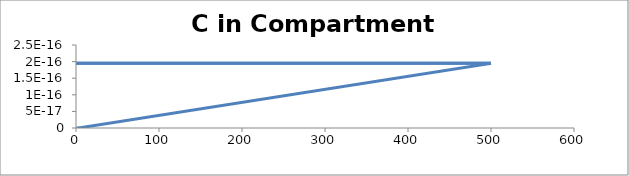
| Category | C - Sys 4 |
|---|---|
| 0.5 | 0 |
| 1.0 | 0 |
| 1.5 | 0 |
| 2.0 | 0 |
| 2.5 | 0 |
| 3.0 | 0 |
| 3.5 | 0 |
| 4.0 | 0 |
| 4.500000000000001 | 0 |
| 5.0 | 0 |
| 5.5 | 0 |
| 6.0 | 0 |
| 6.500000000000001 | 0 |
| 7.0 | 0 |
| 7.5 | 0 |
| 8.0 | 0 |
| 8.5 | 0 |
| 9.000000000000002 | 0 |
| 9.5 | 0 |
| 10.0 | 0 |
| 10.5 | 0 |
| 11.0 | 0 |
| 11.5 | 0 |
| 12.0 | 0 |
| 12.5 | 0 |
| 13.000000000000002 | 0 |
| 13.5 | 0 |
| 14.0 | 0 |
| 14.5 | 0 |
| 15.0 | 0 |
| 15.5 | 0 |
| 16.0 | 0 |
| 16.5 | 0 |
| 17.0 | 0 |
| 17.5 | 0 |
| 18.000000000000004 | 0 |
| 18.5 | 0 |
| 19.0 | 0 |
| 19.5 | 0 |
| 20.0 | 0 |
| 20.5 | 0 |
| 21.0 | 0 |
| 21.5 | 0 |
| 22.0 | 0 |
| 22.5 | 0 |
| 23.0 | 0 |
| 23.5 | 0 |
| 24.0 | 0 |
| 24.5 | 0 |
| 25.0 | 0 |
| 25.500000000000004 | 0 |
| 26.000000000000004 | 0 |
| 26.5 | 0 |
| 27.0 | 0 |
| 27.5 | 0 |
| 28.0 | 0 |
| 28.5 | 0 |
| 29.0 | 0 |
| 29.500000000000004 | 0 |
| 30.0 | 0 |
| 30.5 | 0 |
| 31.0 | 0 |
| 31.5 | 0 |
| 32.0 | 0 |
| 32.5 | 0 |
| 33.0 | 0 |
| 33.5 | 0 |
| 34.0 | 0 |
| 34.5 | 0 |
| 35.0 | 0 |
| 35.50000000000001 | 0 |
| 36.00000000000001 | 0 |
| 36.5 | 0 |
| 37.0 | 0 |
| 37.5 | 0 |
| 38.0 | 0 |
| 38.5 | 0 |
| 39.0 | 0 |
| 39.5 | 0 |
| 40.0 | 0 |
| 40.5 | 0 |
| 41.0 | 0 |
| 41.5 | 0 |
| 42.0 | 0 |
| 42.5 | 0 |
| 43.0 | 0 |
| 43.50000000000001 | 0 |
| 44.0 | 0 |
| 44.5 | 0 |
| 45.0 | 0 |
| 45.5 | 0 |
| 46.0 | 0 |
| 46.5 | 0 |
| 47.0 | 0 |
| 47.5 | 0 |
| 48.0 | 0 |
| 48.5 | 0 |
| 49.0 | 0 |
| 49.5 | 0 |
| 50.0 | 0 |
| 50.5 | 0 |
| 51.00000000000001 | 0 |
| 51.50000000000001 | 0 |
| 52.00000000000001 | 0 |
| 52.5 | 0 |
| 53.0 | 0 |
| 53.5 | 0 |
| 54.0 | 0 |
| 54.5 | 0 |
| 55.0 | 0 |
| 55.5 | 0 |
| 56.0 | 0 |
| 56.5 | 0 |
| 57.0 | 0 |
| 57.5 | 0 |
| 58.0 | 0 |
| 58.5 | 0 |
| 59.00000000000001 | 0 |
| 59.50000000000001 | 0 |
| 60.0 | 0 |
| 60.5 | 0 |
| 61.0 | 0 |
| 61.5 | 0 |
| 62.0 | 0 |
| 62.5 | 0 |
| 63.0 | 0 |
| 63.5 | 0 |
| 64.0 | 0 |
| 64.5 | 0 |
| 65.0 | 0 |
| 65.5 | 0 |
| 66.0 | 0 |
| 66.5 | 0 |
| 67.0 | 0 |
| 67.5 | 0 |
| 68.0 | 0 |
| 68.5 | 0 |
| 69.0 | 0 |
| 69.5 | 0 |
| 70.0 | 0 |
| 70.5 | 0 |
| 71.00000000000001 | 0 |
| 71.50000000000001 | 0 |
| 72.00000000000001 | 0 |
| 72.5 | 0 |
| 73.0 | 0 |
| 73.5 | 0 |
| 74.0 | 0 |
| 74.5 | 0 |
| 75.0 | 0 |
| 75.5 | 0 |
| 76.0 | 0 |
| 76.5 | 0 |
| 77.0 | 0 |
| 77.5 | 0 |
| 78.0 | 0 |
| 78.5 | 0 |
| 79.0 | 0 |
| 79.5 | 0 |
| 80.0 | 0 |
| 80.5 | 0 |
| 81.0 | 0 |
| 81.5 | 0 |
| 82.0 | 0 |
| 82.5 | 0 |
| 83.0 | 0 |
| 83.5 | 0 |
| 84.0 | 0 |
| 84.5 | 0 |
| 85.0 | 0 |
| 85.5 | 0 |
| 86.0 | 0 |
| 86.50000000000001 | 0 |
| 87.00000000000001 | 0 |
| 87.50000000000001 | 0 |
| 88.0 | 0 |
| 88.5 | 0 |
| 89.0 | 0 |
| 89.5 | 0 |
| 90.0 | 0 |
| 90.5 | 0 |
| 91.0 | 0 |
| 91.5 | 0 |
| 92.0 | 0 |
| 92.5 | 0 |
| 93.0 | 0 |
| 93.5 | 0 |
| 94.0 | 0 |
| 94.5 | 0 |
| 95.0 | 0 |
| 95.5 | 0 |
| 96.0 | 0 |
| 96.5 | 0 |
| 97.0 | 0 |
| 97.5 | 0 |
| 98.0 | 0 |
| 98.5 | 0 |
| 99.0 | 0 |
| 99.5 | 0 |
| 100.0 | 0 |
| 100.5 | 0 |
| 101.0 | 0 |
| 101.5 | 0 |
| 102.00000000000001 | 0 |
| 102.50000000000001 | 0 |
| 103.00000000000001 | 0 |
| 103.50000000000001 | 0 |
| 104.00000000000001 | 0 |
| 104.5 | 0 |
| 105.0 | 0 |
| 105.5 | 0 |
| 106.0 | 0 |
| 106.5 | 0 |
| 107.0 | 0 |
| 107.5 | 0 |
| 108.0 | 0 |
| 108.5 | 0 |
| 109.0 | 0 |
| 109.5 | 0 |
| 110.0 | 0 |
| 110.5 | 0 |
| 111.0 | 0 |
| 111.5 | 0 |
| 112.0 | 0 |
| 112.5 | 0 |
| 113.0 | 0 |
| 113.5 | 0 |
| 114.0 | 0 |
| 114.5 | 0 |
| 115.0 | 0 |
| 115.5 | 0 |
| 116.0 | 0 |
| 116.5 | 0 |
| 117.0 | 0 |
| 117.50000000000001 | 0 |
| 118.00000000000001 | 0 |
| 118.50000000000001 | 0 |
| 119.00000000000001 | 0 |
| 119.50000000000001 | 0 |
| 120.0 | 0 |
| 120.5 | 0 |
| 121.0 | 0 |
| 121.5 | 0 |
| 122.0 | 0 |
| 122.5 | 0 |
| 123.0 | 0 |
| 123.5 | 0 |
| 124.0 | 0 |
| 124.5 | 0 |
| 125.0 | 0 |
| 125.5 | 0 |
| 126.0 | 0 |
| 126.5 | 0 |
| 127.0 | 0 |
| 127.5 | 0 |
| 128.0 | 0 |
| 128.5 | 0 |
| 129.0 | 0 |
| 129.5 | 0 |
| 130.0 | 0 |
| 130.5 | 0 |
| 131.0 | 0 |
| 131.5 | 0 |
| 132.0 | 0 |
| 132.5 | 0 |
| 133.0 | 0 |
| 133.5 | 0 |
| 134.0 | 0 |
| 134.5 | 0 |
| 135.0 | 0 |
| 135.5 | 0 |
| 136.0 | 0 |
| 136.5 | 0 |
| 137.0 | 0 |
| 137.5 | 0 |
| 138.0 | 0 |
| 138.5 | 0 |
| 139.0 | 0 |
| 139.5 | 0 |
| 140.0 | 0 |
| 140.5 | 0 |
| 141.0 | 0 |
| 141.50000000000003 | 0 |
| 142.00000000000003 | 0 |
| 142.50000000000003 | 0 |
| 143.00000000000003 | 0 |
| 143.50000000000003 | 0 |
| 144.00000000000003 | 0 |
| 144.5 | 0 |
| 145.0 | 0 |
| 145.5 | 0 |
| 146.0 | 0 |
| 146.5 | 0 |
| 147.0 | 0 |
| 147.5 | 0 |
| 148.0 | 0 |
| 148.5 | 0 |
| 149.0 | 0 |
| 149.5 | 0 |
| 150.0 | 0 |
| 150.5 | 0 |
| 151.0 | 0 |
| 151.5 | 0 |
| 152.0 | 0 |
| 152.5 | 0 |
| 153.0 | 0 |
| 153.5 | 0 |
| 154.0 | 0 |
| 154.5 | 0 |
| 155.0 | 0 |
| 155.5 | 0 |
| 156.0 | 0 |
| 156.5 | 0 |
| 157.0 | 0 |
| 157.5 | 0 |
| 158.0 | 0 |
| 158.5 | 0 |
| 159.0 | 0 |
| 159.5 | 0 |
| 160.0 | 0 |
| 160.5 | 0 |
| 161.0 | 0 |
| 161.5 | 0 |
| 162.0 | 0 |
| 162.5 | 0 |
| 163.0 | 0 |
| 163.5 | 0 |
| 164.0 | 0 |
| 164.5 | 0 |
| 165.0 | 0 |
| 165.5 | 0 |
| 166.0 | 0 |
| 166.5 | 0 |
| 167.0 | 0 |
| 167.5 | 0 |
| 168.0 | 0 |
| 168.5 | 0 |
| 169.0 | 0 |
| 169.5 | 0 |
| 170.0 | 0 |
| 170.5 | 0 |
| 171.0 | 0 |
| 171.5 | 0 |
| 172.0 | 0 |
| 172.50000000000003 | 0 |
| 173.00000000000003 | 0 |
| 173.50000000000003 | 0 |
| 174.00000000000003 | 0 |
| 174.50000000000003 | 0 |
| 175.00000000000003 | 0 |
| 175.50000000000003 | 0 |
| 176.0 | 0 |
| 176.5 | 0 |
| 177.0 | 0 |
| 177.5 | 0 |
| 178.0 | 0 |
| 178.5 | 0 |
| 179.0 | 0 |
| 179.5 | 0 |
| 180.0 | 0 |
| 180.5 | 0 |
| 181.0 | 0 |
| 181.5 | 0 |
| 182.0 | 0 |
| 182.5 | 0 |
| 183.0 | 0 |
| 183.5 | 0 |
| 184.0 | 0 |
| 184.5 | 0 |
| 185.0 | 0 |
| 185.5 | 0 |
| 186.0 | 0 |
| 186.5 | 0 |
| 187.0 | 0 |
| 187.5 | 0 |
| 188.0 | 0 |
| 188.5 | 0 |
| 189.0 | 0 |
| 189.5 | 0 |
| 190.0 | 0 |
| 190.5 | 0 |
| 191.0 | 0 |
| 191.5 | 0 |
| 192.0 | 0 |
| 192.5 | 0 |
| 193.0 | 0 |
| 193.5 | 0 |
| 194.0 | 0 |
| 194.5 | 0 |
| 195.0 | 0 |
| 195.5 | 0 |
| 196.0 | 0 |
| 196.5 | 0 |
| 197.0 | 0 |
| 197.5 | 0 |
| 198.0 | 0 |
| 198.5 | 0 |
| 199.0 | 0 |
| 199.5 | 0 |
| 200.0 | 0 |
| 200.5 | 0 |
| 201.0 | 0 |
| 201.5 | 0 |
| 202.0 | 0 |
| 202.5 | 0 |
| 203.0 | 0 |
| 203.5 | 0 |
| 204.00000000000003 | 0 |
| 204.50000000000003 | 0 |
| 205.00000000000003 | 0 |
| 205.50000000000003 | 0 |
| 206.00000000000003 | 0 |
| 206.50000000000003 | 0 |
| 207.00000000000003 | 0 |
| 207.50000000000003 | 0 |
| 208.00000000000003 | 0 |
| 208.5 | 0 |
| 209.0 | 0 |
| 209.5 | 0 |
| 210.0 | 0 |
| 210.5 | 0 |
| 211.0 | 0 |
| 211.5 | 0 |
| 212.0 | 0 |
| 212.5 | 0 |
| 213.0 | 0 |
| 213.5 | 0 |
| 214.0 | 0 |
| 214.5 | 0 |
| 215.0 | 0 |
| 215.5 | 0 |
| 216.0 | 0 |
| 216.5 | 0 |
| 217.0 | 0 |
| 217.5 | 0 |
| 218.0 | 0 |
| 218.5 | 0 |
| 219.0 | 0 |
| 219.5 | 0 |
| 220.0 | 0 |
| 220.5 | 0 |
| 221.0 | 0 |
| 221.5 | 0 |
| 222.0 | 0 |
| 222.5 | 0 |
| 223.0 | 0 |
| 223.5 | 0 |
| 224.0 | 0 |
| 224.5 | 0 |
| 225.0 | 0 |
| 225.5 | 0 |
| 226.0 | 0 |
| 226.5 | 0 |
| 227.0 | 0 |
| 227.5 | 0 |
| 228.0 | 0 |
| 228.5 | 0 |
| 229.0 | 0 |
| 229.5 | 0 |
| 230.0 | 0 |
| 230.5 | 0 |
| 231.0 | 0 |
| 231.5 | 0 |
| 232.0 | 0 |
| 232.5 | 0 |
| 233.0 | 0 |
| 233.5 | 0 |
| 234.0 | 0 |
| 234.5 | 0 |
| 235.00000000000003 | 0 |
| 235.50000000000003 | 0 |
| 236.00000000000003 | 0 |
| 236.50000000000003 | 0 |
| 237.00000000000003 | 0 |
| 237.50000000000003 | 0 |
| 238.00000000000003 | 0 |
| 238.50000000000003 | 0 |
| 239.00000000000003 | 0 |
| 239.50000000000003 | 0 |
| 240.0 | 0 |
| 240.5 | 0 |
| 241.0 | 0 |
| 241.5 | 0 |
| 242.0 | 0 |
| 242.5 | 0 |
| 243.0 | 0 |
| 243.5 | 0 |
| 244.0 | 0 |
| 244.5 | 0 |
| 245.0 | 0 |
| 245.5 | 0 |
| 246.0 | 0 |
| 246.5 | 0 |
| 247.0 | 0 |
| 247.5 | 0 |
| 248.0 | 0 |
| 248.5 | 0 |
| 249.0 | 0 |
| 249.5 | 0 |
| 250.0 | 0 |
| 250.5 | 0 |
| 251.0 | 0 |
| 251.5 | 0 |
| 252.0 | 0 |
| 252.5 | 0 |
| 253.0 | 0 |
| 253.5 | 0 |
| 254.0 | 0 |
| 254.5 | 0 |
| 255.0 | 0 |
| 255.5 | 0 |
| 256.0 | 0 |
| 256.5 | 0 |
| 257.0 | 0 |
| 257.5 | 0 |
| 258.0 | 0 |
| 258.5 | 0 |
| 259.0 | 0 |
| 259.5 | 0 |
| 260.0 | 0 |
| 260.5 | 0 |
| 261.0 | 0 |
| 261.5 | 0 |
| 262.0 | 0 |
| 262.5 | 0 |
| 263.0 | 0 |
| 263.5 | 0 |
| 264.0 | 0 |
| 264.5 | 0 |
| 265.0 | 0 |
| 265.5 | 0 |
| 266.0 | 0 |
| 266.5 | 0 |
| 267.0 | 0 |
| 267.5 | 0 |
| 268.0 | 0 |
| 268.5 | 0 |
| 269.0 | 0 |
| 269.5 | 0 |
| 270.0 | 0 |
| 270.5 | 0 |
| 271.0 | 0 |
| 271.5 | 0 |
| 272.0 | 0 |
| 272.5 | 0 |
| 273.0 | 0 |
| 273.5 | 0 |
| 274.0 | 0 |
| 274.5 | 0 |
| 275.0 | 0 |
| 275.5 | 0 |
| 276.0 | 0 |
| 276.5 | 0 |
| 277.0 | 0 |
| 277.5 | 0 |
| 278.0 | 0 |
| 278.5 | 0 |
| 279.0 | 0 |
| 279.5 | 0 |
| 280.0 | 0 |
| 280.5 | 0 |
| 281.0 | 0 |
| 281.5 | 0 |
| 282.0 | 0 |
| 282.50000000000006 | 0 |
| 283.00000000000006 | 0 |
| 283.50000000000006 | 0 |
| 284.00000000000006 | 0 |
| 284.50000000000006 | 0 |
| 285.00000000000006 | 0 |
| 285.50000000000006 | 0 |
| 286.00000000000006 | 0 |
| 286.50000000000006 | 0 |
| 287.00000000000006 | 0 |
| 287.50000000000006 | 0 |
| 288.00000000000006 | 0 |
| 288.5 | 0 |
| 289.0 | 0 |
| 289.5 | 0 |
| 290.0 | 0 |
| 290.5 | 0 |
| 291.0 | 0 |
| 291.5 | 0 |
| 292.0 | 0 |
| 292.5 | 0 |
| 293.0 | 0 |
| 293.5 | 0 |
| 294.0 | 0 |
| 294.5 | 0 |
| 295.0 | 0 |
| 295.5 | 0 |
| 296.0 | 0 |
| 296.5 | 0 |
| 297.0 | 0 |
| 297.5 | 0 |
| 298.0 | 0 |
| 298.5 | 0 |
| 299.0 | 0 |
| 299.5 | 0 |
| 300.0 | 0 |
| 300.5 | 0 |
| 301.0 | 0 |
| 301.5 | 0 |
| 302.0 | 0 |
| 302.5 | 0 |
| 303.0 | 0 |
| 303.5 | 0 |
| 304.0 | 0 |
| 304.5 | 0 |
| 305.0 | 0 |
| 305.5 | 0 |
| 306.0 | 0 |
| 306.5 | 0 |
| 307.0 | 0 |
| 307.5 | 0 |
| 308.0 | 0 |
| 308.5 | 0 |
| 309.0 | 0 |
| 309.5 | 0 |
| 310.0 | 0 |
| 310.5 | 0 |
| 311.0 | 0 |
| 311.5 | 0 |
| 312.0 | 0 |
| 312.5 | 0 |
| 313.0 | 0 |
| 313.5 | 0 |
| 314.0 | 0 |
| 314.5 | 0 |
| 315.0 | 0 |
| 315.5 | 0 |
| 316.0 | 0 |
| 316.5 | 0 |
| 317.0 | 0 |
| 317.5 | 0 |
| 318.0 | 0 |
| 318.5 | 0 |
| 319.0 | 0 |
| 319.5 | 0 |
| 320.0 | 0 |
| 320.5 | 0 |
| 321.0 | 0 |
| 321.5 | 0 |
| 322.0 | 0 |
| 322.5 | 0 |
| 323.0 | 0 |
| 323.5 | 0 |
| 324.0 | 0 |
| 324.5 | 0 |
| 325.0 | 0 |
| 325.5 | 0 |
| 326.0 | 0 |
| 326.5 | 0 |
| 327.0 | 0 |
| 327.5 | 0 |
| 328.0 | 0 |
| 328.5 | 0 |
| 329.0 | 0 |
| 329.5 | 0 |
| 330.0 | 0 |
| 330.5 | 0 |
| 331.0 | 0 |
| 331.5 | 0 |
| 332.0 | 0 |
| 332.5 | 0 |
| 333.0 | 0 |
| 333.5 | 0 |
| 334.0 | 0 |
| 334.5 | 0 |
| 335.0 | 0 |
| 335.5 | 0 |
| 336.0 | 0 |
| 336.5 | 0 |
| 337.0 | 0 |
| 337.5 | 0 |
| 338.0 | 0 |
| 338.5 | 0 |
| 339.0 | 0 |
| 339.5 | 0 |
| 340.0 | 0 |
| 340.5 | 0 |
| 341.0 | 0 |
| 341.5 | 0 |
| 342.0 | 0 |
| 342.5 | 0 |
| 343.0 | 0 |
| 343.5 | 0 |
| 344.0 | 0 |
| 344.5 | 0 |
| 345.00000000000006 | 0 |
| 345.50000000000006 | 0 |
| 346.00000000000006 | 0 |
| 346.50000000000006 | 0 |
| 347.00000000000006 | 0 |
| 347.50000000000006 | 0 |
| 348.00000000000006 | 0 |
| 348.50000000000006 | 0 |
| 349.00000000000006 | 0 |
| 349.50000000000006 | 0 |
| 350.00000000000006 | 0 |
| 350.50000000000006 | 0 |
| 351.00000000000006 | 0 |
| 351.50000000000006 | 0 |
| 352.0 | 0 |
| 352.5 | 0 |
| 353.0 | 0 |
| 353.5 | 0 |
| 354.0 | 0 |
| 354.5 | 0 |
| 355.0 | 0 |
| 355.5 | 0 |
| 356.0 | 0 |
| 356.5 | 0 |
| 357.0 | 0 |
| 357.5 | 0 |
| 358.0 | 0 |
| 358.5 | 0 |
| 359.0 | 0 |
| 359.5 | 0 |
| 360.0 | 0 |
| 360.5 | 0 |
| 361.0 | 0 |
| 361.5 | 0 |
| 362.0 | 0 |
| 362.5 | 0 |
| 363.0 | 0 |
| 363.5 | 0 |
| 364.0 | 0 |
| 364.5 | 0 |
| 365.0 | 0 |
| 365.5 | 0 |
| 366.0 | 0 |
| 366.5 | 0 |
| 367.0 | 0 |
| 367.5 | 0 |
| 368.0 | 0 |
| 368.5 | 0 |
| 369.0 | 0 |
| 369.5 | 0 |
| 370.0 | 0 |
| 370.5 | 0 |
| 371.0 | 0 |
| 371.5 | 0 |
| 372.0 | 0 |
| 372.5 | 0 |
| 373.0 | 0 |
| 373.5 | 0 |
| 374.0 | 0 |
| 374.5 | 0 |
| 375.0 | 0 |
| 375.5 | 0 |
| 376.0 | 0 |
| 376.5 | 0 |
| 377.0 | 0 |
| 377.5 | 0 |
| 378.0 | 0 |
| 378.5 | 0 |
| 379.0 | 0 |
| 379.5 | 0 |
| 380.0 | 0 |
| 380.5 | 0 |
| 381.0 | 0 |
| 381.5 | 0 |
| 382.0 | 0 |
| 382.5 | 0 |
| 383.0 | 0 |
| 383.5 | 0 |
| 384.0 | 0 |
| 384.5 | 0 |
| 385.0 | 0 |
| 385.5 | 0 |
| 386.0 | 0 |
| 386.5 | 0 |
| 387.0 | 0 |
| 387.5 | 0 |
| 388.0 | 0 |
| 388.5 | 0 |
| 389.0 | 0 |
| 389.5 | 0 |
| 390.0 | 0 |
| 390.5 | 0 |
| 391.0 | 0 |
| 391.5 | 0 |
| 392.0 | 0 |
| 392.5 | 0 |
| 393.0 | 0 |
| 393.5 | 0 |
| 394.0 | 0 |
| 394.5 | 0 |
| 395.0 | 0 |
| 395.5 | 0 |
| 396.0 | 0 |
| 396.5 | 0 |
| 397.0 | 0 |
| 397.5 | 0 |
| 398.0 | 0 |
| 398.5 | 0 |
| 399.0 | 0 |
| 399.5 | 0 |
| 400.0 | 0 |
| 400.5 | 0 |
| 401.0 | 0 |
| 401.5 | 0 |
| 402.0 | 0 |
| 402.5 | 0 |
| 403.0 | 0 |
| 403.5 | 0 |
| 404.0 | 0 |
| 404.5 | 0 |
| 405.0 | 0 |
| 405.5 | 0 |
| 406.0 | 0 |
| 406.5 | 0 |
| 407.0 | 0 |
| 407.50000000000006 | 0 |
| 408.00000000000006 | 0 |
| 408.50000000000006 | 0 |
| 409.00000000000006 | 0 |
| 409.50000000000006 | 0 |
| 410.00000000000006 | 0 |
| 410.50000000000006 | 0 |
| 411.00000000000006 | 0 |
| 411.50000000000006 | 0 |
| 412.00000000000006 | 0 |
| 412.50000000000006 | 0 |
| 413.00000000000006 | 0 |
| 413.50000000000006 | 0 |
| 414.00000000000006 | 0 |
| 414.50000000000006 | 0 |
| 415.00000000000006 | 0 |
| 415.50000000000006 | 0 |
| 416.00000000000006 | 0 |
| 416.5 | 0 |
| 417.0 | 0 |
| 417.5 | 0 |
| 418.0 | 0 |
| 418.5 | 0 |
| 419.0 | 0 |
| 419.5 | 0 |
| 420.0 | 0 |
| 420.5 | 0 |
| 421.0 | 0 |
| 421.5 | 0 |
| 422.0 | 0 |
| 422.5 | 0 |
| 423.0 | 0 |
| 423.5 | 0 |
| 424.0 | 0 |
| 424.5 | 0 |
| 425.0 | 0 |
| 425.5 | 0 |
| 426.0 | 0 |
| 426.5 | 0 |
| 427.0 | 0 |
| 427.5 | 0 |
| 428.0 | 0 |
| 428.5 | 0 |
| 429.0 | 0 |
| 429.5 | 0 |
| 430.0 | 0 |
| 430.5 | 0 |
| 431.0 | 0 |
| 431.5 | 0 |
| 432.0 | 0 |
| 432.5 | 0 |
| 433.0 | 0 |
| 433.5 | 0 |
| 434.0 | 0 |
| 434.5 | 0 |
| 435.0 | 0 |
| 435.5 | 0 |
| 436.0 | 0 |
| 436.5 | 0 |
| 437.0 | 0 |
| 437.5 | 0 |
| 438.0 | 0 |
| 438.5 | 0 |
| 439.0 | 0 |
| 439.5 | 0 |
| 440.0 | 0 |
| 440.5 | 0 |
| 441.0 | 0 |
| 441.5 | 0 |
| 442.0 | 0 |
| 442.5 | 0 |
| 443.0 | 0 |
| 443.5 | 0 |
| 444.0 | 0 |
| 444.5 | 0 |
| 445.0 | 0 |
| 445.5 | 0 |
| 446.0 | 0 |
| 446.5 | 0 |
| 447.0 | 0 |
| 447.5 | 0 |
| 448.0 | 0 |
| 448.5 | 0 |
| 449.0 | 0 |
| 449.5 | 0 |
| 450.0 | 0 |
| 450.5 | 0 |
| 451.0 | 0 |
| 451.5 | 0 |
| 452.0 | 0 |
| 452.5 | 0 |
| 453.0 | 0 |
| 453.5 | 0 |
| 454.0 | 0 |
| 454.5 | 0 |
| 455.0 | 0 |
| 455.5 | 0 |
| 456.0 | 0 |
| 456.5 | 0 |
| 457.0 | 0 |
| 457.5 | 0 |
| 458.0 | 0 |
| 458.5 | 0 |
| 459.0 | 0 |
| 459.5 | 0 |
| 460.0 | 0 |
| 460.5 | 0 |
| 461.0 | 0 |
| 461.5 | 0 |
| 462.0 | 0 |
| 462.5 | 0 |
| 463.0 | 0 |
| 463.5 | 0 |
| 464.0 | 0 |
| 464.5 | 0 |
| 465.0 | 0 |
| 465.5 | 0 |
| 466.0 | 0 |
| 466.5 | 0 |
| 467.0 | 0 |
| 467.5 | 0 |
| 468.0 | 0 |
| 468.5 | 0 |
| 469.0 | 0 |
| 469.5 | 0 |
| 470.00000000000006 | 0 |
| 470.50000000000006 | 0 |
| 471.00000000000006 | 0 |
| 471.50000000000006 | 0 |
| 472.00000000000006 | 0 |
| 472.50000000000006 | 0 |
| 473.00000000000006 | 0 |
| 473.50000000000006 | 0 |
| 474.00000000000006 | 0 |
| 474.50000000000006 | 0 |
| 475.00000000000006 | 0 |
| 475.50000000000006 | 0 |
| 476.00000000000006 | 0 |
| 476.50000000000006 | 0 |
| 477.00000000000006 | 0 |
| 477.50000000000006 | 0 |
| 478.00000000000006 | 0 |
| 478.50000000000006 | 0 |
| 479.00000000000006 | 0 |
| 479.50000000000006 | 0 |
| 480.0 | 0 |
| 480.5 | 0 |
| 481.0 | 0 |
| 481.5 | 0 |
| 482.0 | 0 |
| 482.5 | 0 |
| 483.0 | 0 |
| 483.5 | 0 |
| 484.0 | 0 |
| 484.5 | 0 |
| 485.0 | 0 |
| 485.5 | 0 |
| 486.0 | 0 |
| 486.5 | 0 |
| 487.0 | 0 |
| 487.5 | 0 |
| 488.0 | 0 |
| 488.5 | 0 |
| 489.0 | 0 |
| 489.5 | 0 |
| 490.0 | 0 |
| 490.5 | 0 |
| 491.0 | 0 |
| 491.5 | 0 |
| 492.0 | 0 |
| 492.5 | 0 |
| 493.0 | 0 |
| 493.5 | 0 |
| 494.0 | 0 |
| 494.5 | 0 |
| 495.0 | 0 |
| 495.5 | 0 |
| 496.0 | 0 |
| 496.5 | 0 |
| 497.0 | 0 |
| 497.5 | 0 |
| 498.0 | 0 |
| 498.5 | 0 |
| 499.0 | 0 |
| 499.5 | 0 |
| 500.0 | 0 |